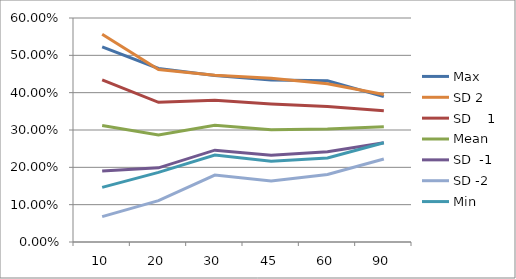
| Category | Max | SD 2 | SD    1 | Mean | SD  -1 | SD -2 | Min |
|---|---|---|---|---|---|---|---|
| 10.0 | 0.523 | 0.556 | 0.434 | 0.312 | 0.19 | 0.068 | 0.146 |
| 20.0 | 0.465 | 0.462 | 0.374 | 0.286 | 0.199 | 0.111 | 0.187 |
| 30.0 | 0.446 | 0.446 | 0.38 | 0.313 | 0.246 | 0.179 | 0.233 |
| 45.0 | 0.434 | 0.439 | 0.37 | 0.301 | 0.232 | 0.163 | 0.216 |
| 60.0 | 0.432 | 0.424 | 0.363 | 0.302 | 0.242 | 0.181 | 0.225 |
| 90.0 | 0.389 | 0.395 | 0.352 | 0.309 | 0.266 | 0.222 | 0.266 |